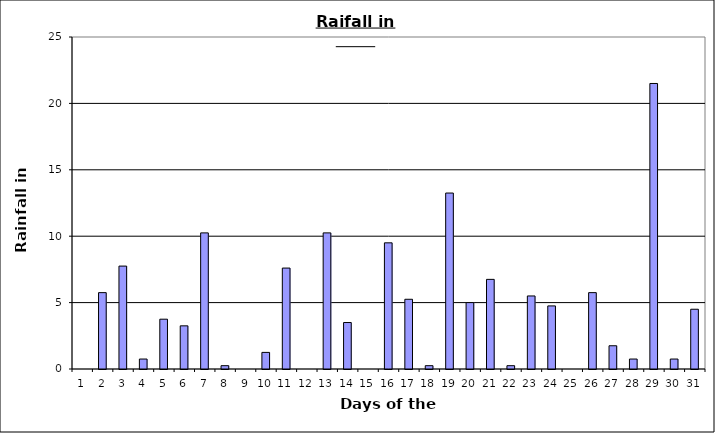
| Category | Series 0 |
|---|---|
| 0 | 0 |
| 1 | 5.75 |
| 2 | 7.75 |
| 3 | 0.75 |
| 4 | 3.75 |
| 5 | 3.25 |
| 6 | 10.25 |
| 7 | 0.25 |
| 8 | 0 |
| 9 | 1.25 |
| 10 | 7.6 |
| 11 | 0 |
| 12 | 10.25 |
| 13 | 3.5 |
| 14 | 0 |
| 15 | 9.5 |
| 16 | 5.25 |
| 17 | 0.25 |
| 18 | 13.25 |
| 19 | 5 |
| 20 | 6.75 |
| 21 | 0.25 |
| 22 | 5.5 |
| 23 | 4.75 |
| 24 | 0 |
| 25 | 5.75 |
| 26 | 1.75 |
| 27 | 0.75 |
| 28 | 21.5 |
| 29 | 0.75 |
| 30 | 4.5 |